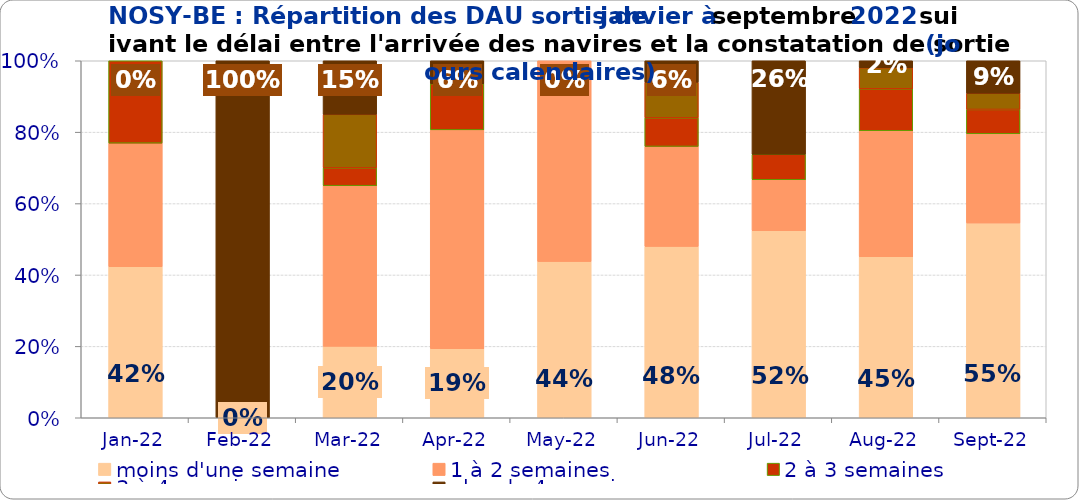
| Category | moins d'une semaine | 1 à 2 semaines | 2 à 3 semaines | 3 à 4 semaines | plus de 4 semaines |
|---|---|---|---|---|---|
| 2022-01-01 | 0.423 | 0.346 | 0.231 | 0 | 0 |
| 2022-02-01 | 0 | 0 | 0 | 0 | 1 |
| 2022-03-01 | 0.2 | 0.45 | 0.05 | 0.15 | 0.15 |
| 2022-04-01 | 0.194 | 0.613 | 0.129 | 0 | 0.065 |
| 2022-05-01 | 0.438 | 0.562 | 0 | 0 | 0 |
| 2022-06-01 | 0.48 | 0.28 | 0.08 | 0.1 | 0.06 |
| 2022-07-01 | 0.524 | 0.143 | 0.071 | 0 | 0.262 |
| 2022-08-01 | 0.451 | 0.353 | 0.118 | 0.059 | 0.02 |
| 2022-09-01 | 0.545 | 0.25 | 0.068 | 0.045 | 0.091 |